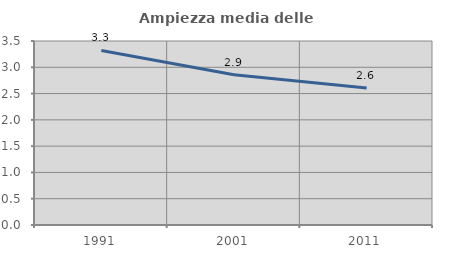
| Category | Ampiezza media delle famiglie |
|---|---|
| 1991.0 | 3.321 |
| 2001.0 | 2.859 |
| 2011.0 | 2.607 |